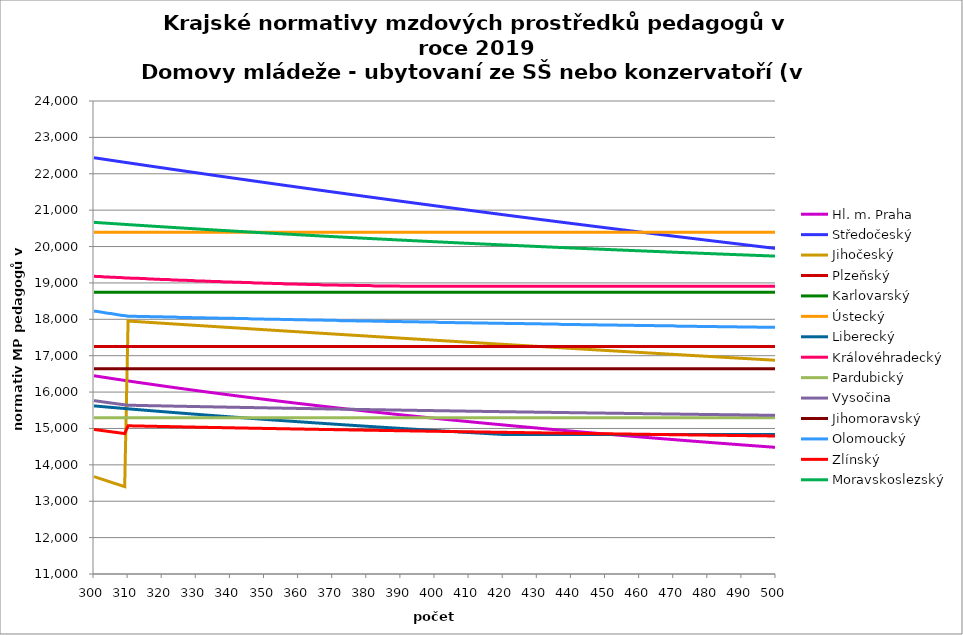
| Category | Hl. m. Praha | Středočeský | Jihočeský | Plzeňský | Karlovarský  | Ústecký   | Liberecký | Královéhradecký | Pardubický | Vysočina | Jihomoravský | Olomoucký | Zlínský | Moravskoslezský |
|---|---|---|---|---|---|---|---|---|---|---|---|---|---|---|
| 300.0 | 16448.592 | 22440.625 | 13677.41 | 17250 | 18742.857 | 20395.281 | 15620.336 | 19183.721 | 15293.222 | 15765.083 | 16640.392 | 18224.319 | 14973.191 | 20665.222 |
| 301.0 | 16434.039 | 22426.608 | 13646.147 | 17250 | 18742.857 | 20395.281 | 15612.162 | 19174.431 | 15293.222 | 15751.859 | 16640.392 | 18216.054 | 14960.34 | 20658.89 |
| 302.0 | 16419.559 | 22412.609 | 13615.027 | 17250 | 18742.857 | 20395.281 | 15604.023 | 19174.431 | 15293.222 | 15738.657 | 16640.392 | 18199.547 | 14947.554 | 20652.582 |
| 303.0 | 16405.153 | 22398.628 | 13584.048 | 17250 | 18742.857 | 20395.281 | 15595.92 | 19165.15 | 15293.222 | 15725.477 | 16640.392 | 18183.069 | 14934.831 | 20646.299 |
| 304.0 | 16390.819 | 22384.663 | 13553.21 | 17250 | 18742.857 | 20395.281 | 15587.852 | 19165.15 | 15293.222 | 15712.916 | 16640.392 | 18166.621 | 14922.172 | 20640.041 |
| 305.0 | 16376.558 | 22370.717 | 13522.511 | 17250 | 18742.857 | 20395.281 | 15579.819 | 19155.878 | 15293.222 | 15699.78 | 16640.392 | 18158.409 | 14909.576 | 20633.807 |
| 306.0 | 16362.367 | 22356.787 | 13491.951 | 17250 | 18742.857 | 20395.281 | 15571.82 | 19155.878 | 15293.222 | 15687.26 | 16640.392 | 18142.005 | 14897.042 | 20627.597 |
| 307.0 | 16348.248 | 22342.875 | 13461.53 | 17250 | 18742.857 | 20395.281 | 15563.856 | 19146.615 | 15293.222 | 15674.166 | 16640.392 | 18125.632 | 14884.57 | 20621.411 |
| 308.0 | 16334.198 | 22328.98 | 13431.245 | 17250 | 18742.857 | 20395.281 | 15555.925 | 19146.615 | 15293.222 | 15661.688 | 16640.392 | 18109.288 | 14872.159 | 20615.248 |
| 309.0 | 16320.218 | 22315.103 | 13401.096 | 17250 | 18742.857 | 20395.281 | 15548.029 | 19137.361 | 15293.222 | 15649.229 | 16640.392 | 18101.127 | 14859.809 | 20609.11 |
| 310.0 | 16306.307 | 22301.242 | 17952.762 | 17250 | 18742.857 | 20395.281 | 15540.165 | 19137.361 | 15293.222 | 15638.566 | 16640.392 | 18084.827 | 15073.362 | 20602.995 |
| 311.0 | 16292.465 | 22287.399 | 17946.723 | 17250 | 18742.857 | 20395.281 | 15532.335 | 19128.116 | 15293.222 | 15636.79 | 16640.392 | 18084.827 | 15071.439 | 20596.903 |
| 312.0 | 16278.69 | 22273.573 | 17940.688 | 17250 | 18742.857 | 20395.281 | 15524.539 | 19128.116 | 15293.222 | 15635.015 | 16640.392 | 18084.827 | 15069.522 | 20590.834 |
| 313.0 | 16264.983 | 22259.764 | 17934.657 | 17250 | 18742.857 | 20395.281 | 15516.774 | 19128.116 | 15293.222 | 15633.24 | 16640.392 | 18076.688 | 15067.612 | 20584.789 |
| 314.0 | 16251.342 | 22245.973 | 17928.63 | 17250 | 18742.857 | 20395.281 | 15509.043 | 19118.88 | 15293.222 | 15631.465 | 16640.392 | 18076.688 | 15065.709 | 20578.766 |
| 315.0 | 16237.767 | 22232.198 | 17922.607 | 17250 | 18742.857 | 20395.281 | 15501.343 | 19118.88 | 15293.222 | 15629.1 | 16640.392 | 18076.688 | 15063.812 | 20572.766 |
| 316.0 | 16224.258 | 22218.441 | 17916.589 | 17250 | 18742.857 | 20395.281 | 15493.676 | 19109.653 | 15293.222 | 15627.326 | 16640.392 | 18076.688 | 15061.921 | 20566.788 |
| 317.0 | 16210.814 | 22204.7 | 17910.574 | 17250 | 18742.857 | 20395.281 | 15486.04 | 19109.653 | 15293.222 | 15625.553 | 16640.392 | 18068.556 | 15060.037 | 20560.833 |
| 318.0 | 16197.434 | 22190.977 | 17904.563 | 17250 | 18742.857 | 20395.281 | 15478.436 | 19100.434 | 15293.222 | 15623.78 | 16640.392 | 18068.556 | 15058.16 | 20554.899 |
| 319.0 | 16184.119 | 22177.27 | 17898.557 | 17250 | 18742.857 | 20395.281 | 15470.863 | 19100.434 | 15293.222 | 15622.008 | 16640.392 | 18068.556 | 15056.288 | 20548.988 |
| 320.0 | 16170.866 | 22163.58 | 17892.554 | 17250 | 18742.857 | 20395.281 | 15463.321 | 19091.225 | 15293.222 | 15620.236 | 16640.392 | 18068.556 | 15054.423 | 20543.099 |
| 321.0 | 16157.677 | 22149.907 | 17886.555 | 17250 | 18742.857 | 20395.281 | 15455.81 | 19091.225 | 15293.222 | 15618.464 | 16640.392 | 18060.432 | 15052.565 | 20537.232 |
| 322.0 | 16144.55 | 22136.252 | 17880.561 | 17250 | 18742.857 | 20395.281 | 15448.33 | 19091.225 | 15293.222 | 15616.103 | 16640.392 | 18060.432 | 15050.712 | 20531.386 |
| 323.0 | 16131.485 | 22122.612 | 17874.57 | 17250 | 18742.857 | 20395.281 | 15440.88 | 19082.024 | 15293.222 | 15614.332 | 16640.392 | 18060.432 | 15048.866 | 20525.561 |
| 324.0 | 16118.482 | 22108.99 | 17868.584 | 17250 | 18742.857 | 20395.281 | 15433.46 | 19082.024 | 15293.222 | 15612.562 | 16640.392 | 18060.432 | 15047.026 | 20519.758 |
| 325.0 | 16105.539 | 22095.385 | 17862.601 | 17250 | 18742.857 | 20395.281 | 15426.07 | 19072.832 | 15293.222 | 15610.792 | 16640.392 | 18052.315 | 15045.192 | 20513.976 |
| 326.0 | 16092.657 | 22081.796 | 17856.623 | 17250 | 18742.857 | 20395.281 | 15418.71 | 19072.832 | 15293.222 | 15609.023 | 16640.392 | 18052.315 | 15043.364 | 20508.215 |
| 327.0 | 16079.835 | 22068.224 | 17850.648 | 17250 | 18742.857 | 20395.281 | 15411.38 | 19072.832 | 15293.222 | 15607.253 | 16640.392 | 18052.315 | 15041.542 | 20502.475 |
| 328.0 | 16067.072 | 22054.668 | 17844.678 | 17250 | 18742.857 | 20395.281 | 15404.078 | 19063.649 | 15293.222 | 15605.485 | 16640.392 | 18052.315 | 15039.726 | 20496.755 |
| 329.0 | 16054.369 | 22041.13 | 17838.711 | 17250 | 18742.857 | 20395.281 | 15396.806 | 19063.649 | 15293.222 | 15603.717 | 16640.392 | 18044.205 | 15037.916 | 20491.056 |
| 330.0 | 16041.724 | 22027.607 | 17832.748 | 17250 | 18742.857 | 20395.281 | 15389.563 | 19054.475 | 15293.222 | 15601.949 | 16640.392 | 18044.205 | 15036.112 | 20485.378 |
| 331.0 | 16029.137 | 22014.102 | 17826.79 | 17250 | 18742.857 | 20395.281 | 15382.349 | 19054.475 | 15293.222 | 15600.181 | 16640.392 | 18044.205 | 15034.314 | 20479.72 |
| 332.0 | 16016.607 | 22000.613 | 17820.835 | 17250 | 18742.857 | 20395.281 | 15375.163 | 19054.475 | 15293.222 | 15598.414 | 16640.392 | 18044.205 | 15032.522 | 20474.082 |
| 333.0 | 16004.135 | 21987.14 | 17814.885 | 17250 | 18742.857 | 20395.281 | 15368.005 | 19045.31 | 15293.222 | 15596.648 | 16640.392 | 18036.102 | 15030.736 | 20468.464 |
| 334.0 | 15991.719 | 21973.684 | 17808.938 | 17250 | 18742.857 | 20395.281 | 15360.875 | 19045.31 | 15293.222 | 15594.881 | 16640.392 | 18036.102 | 15028.955 | 20462.866 |
| 335.0 | 15979.36 | 21960.245 | 17802.995 | 17250 | 18742.857 | 20395.281 | 15353.774 | 19036.154 | 15293.222 | 15593.115 | 16640.392 | 18036.102 | 15027.18 | 20457.288 |
| 336.0 | 15967.056 | 21946.822 | 17797.057 | 17250 | 18742.857 | 20395.281 | 15346.7 | 19036.154 | 15293.222 | 15591.35 | 16640.392 | 18036.102 | 15025.411 | 20451.729 |
| 337.0 | 15954.808 | 21933.415 | 17791.122 | 17250 | 18742.857 | 20395.281 | 15339.653 | 19036.154 | 15293.222 | 15589.585 | 16640.392 | 18028.007 | 15023.647 | 20446.19 |
| 338.0 | 15942.615 | 21920.024 | 17785.191 | 17250 | 18742.857 | 20395.281 | 15332.634 | 19027.006 | 15293.222 | 15587.82 | 16640.392 | 18028.007 | 15021.89 | 20440.671 |
| 339.0 | 15930.477 | 21906.65 | 17779.264 | 17250 | 18742.857 | 20395.281 | 15325.642 | 19027.006 | 15293.222 | 15586.056 | 16640.392 | 18028.007 | 15020.137 | 20435.17 |
| 340.0 | 15918.392 | 21893.293 | 17773.341 | 17250 | 18742.857 | 20395.281 | 15318.677 | 19027.006 | 15293.222 | 15584.292 | 16640.392 | 18028.007 | 15018.391 | 20429.689 |
| 341.0 | 15906.362 | 21879.951 | 17767.422 | 17250 | 18742.857 | 20395.281 | 15311.738 | 19017.867 | 15293.222 | 15582.529 | 16640.392 | 18028.007 | 15016.649 | 20424.227 |
| 342.0 | 15894.384 | 21866.626 | 17761.507 | 17250 | 18742.857 | 20395.281 | 15304.827 | 19017.867 | 15293.222 | 15580.766 | 16640.392 | 18019.919 | 15014.914 | 20418.784 |
| 343.0 | 15882.46 | 21853.317 | 17755.596 | 17250 | 18742.857 | 20395.281 | 15297.941 | 19017.867 | 15293.222 | 15579.003 | 16640.392 | 18019.919 | 15013.184 | 20413.359 |
| 344.0 | 15870.588 | 21840.024 | 17749.689 | 17250 | 18742.857 | 20395.281 | 15291.082 | 19008.737 | 15293.222 | 15577.241 | 16640.392 | 18019.919 | 15011.459 | 20407.954 |
| 345.0 | 15858.768 | 21826.748 | 17743.786 | 17250 | 18742.857 | 20395.281 | 15284.249 | 19008.737 | 15293.222 | 15575.479 | 16640.392 | 18019.919 | 15009.74 | 20402.566 |
| 346.0 | 15847 | 21813.487 | 17737.887 | 17250 | 18742.857 | 20395.281 | 15277.442 | 19008.737 | 15293.222 | 15574.304 | 16640.392 | 18011.839 | 15008.026 | 20397.197 |
| 347.0 | 15835.284 | 21800.243 | 17731.991 | 17250 | 18742.857 | 20395.281 | 15270.66 | 18999.616 | 15293.222 | 15572.543 | 16640.392 | 18011.839 | 15006.317 | 20391.847 |
| 348.0 | 15823.618 | 21787.015 | 17726.1 | 17250 | 18742.857 | 20395.281 | 15263.904 | 18999.616 | 15293.222 | 15570.782 | 16640.392 | 18011.839 | 15004.614 | 20386.515 |
| 349.0 | 15812.003 | 21773.802 | 17720.212 | 17250 | 18742.857 | 20395.281 | 15257.173 | 18999.616 | 15293.222 | 15569.022 | 16640.392 | 18011.839 | 15002.915 | 20381.2 |
| 350.0 | 15800.438 | 21760.606 | 17714.329 | 17250 | 18742.857 | 20395.281 | 15250.467 | 18990.504 | 15293.222 | 15567.262 | 16640.392 | 18003.765 | 15001.223 | 20375.904 |
| 351.0 | 15788.923 | 21747.426 | 17708.449 | 17250 | 18742.857 | 20395.281 | 15243.787 | 18990.504 | 15293.222 | 15565.502 | 16640.392 | 18003.765 | 14999.535 | 20370.625 |
| 352.0 | 15777.457 | 21734.262 | 17702.573 | 17250 | 18742.857 | 20395.281 | 15237.131 | 18990.504 | 15293.222 | 15563.743 | 16640.392 | 18003.765 | 14997.853 | 20365.365 |
| 353.0 | 15766.04 | 21721.113 | 17696.701 | 17250 | 18742.857 | 20395.281 | 15230.5 | 18981.4 | 15293.222 | 15562.571 | 16640.392 | 18003.765 | 14996.175 | 20360.122 |
| 354.0 | 15754.673 | 21707.981 | 17690.833 | 17250 | 18742.857 | 20395.281 | 15223.893 | 18981.4 | 15293.222 | 15560.812 | 16640.392 | 18003.765 | 14994.503 | 20354.896 |
| 355.0 | 15743.353 | 21694.864 | 17684.969 | 17250 | 18742.857 | 20395.281 | 15217.311 | 18981.4 | 15293.222 | 15559.054 | 16640.392 | 17995.699 | 14992.836 | 20349.688 |
| 356.0 | 15732.082 | 21681.763 | 17679.109 | 17250 | 18742.857 | 20395.281 | 15210.753 | 18972.305 | 15293.222 | 15557.296 | 16640.392 | 17995.699 | 14991.174 | 20344.497 |
| 357.0 | 15720.858 | 21668.678 | 17673.253 | 17250 | 18742.857 | 20395.281 | 15204.219 | 18972.305 | 15293.222 | 15555.539 | 16640.392 | 17995.699 | 14989.517 | 20339.323 |
| 358.0 | 15709.682 | 21655.609 | 17667.4 | 17250 | 18742.857 | 20395.281 | 15197.709 | 18972.305 | 15293.222 | 15553.782 | 16640.392 | 17995.699 | 14987.865 | 20334.167 |
| 359.0 | 15698.552 | 21642.556 | 17661.552 | 17250 | 18742.857 | 20395.281 | 15191.222 | 18972.305 | 15293.222 | 15552.611 | 16640.392 | 17987.64 | 14986.218 | 20329.027 |
| 360.0 | 15687.469 | 21629.518 | 17655.707 | 17250 | 18742.857 | 20395.281 | 15184.759 | 18963.218 | 15293.222 | 15550.854 | 16640.392 | 17987.64 | 14984.576 | 20323.905 |
| 361.0 | 15676.433 | 21616.496 | 17649.866 | 17250 | 18742.857 | 20395.281 | 15178.32 | 18963.218 | 15293.222 | 15549.099 | 16640.392 | 17987.64 | 14982.939 | 20318.799 |
| 362.0 | 15665.442 | 21603.49 | 17644.029 | 17250 | 18742.857 | 20395.281 | 15171.903 | 18963.218 | 15293.222 | 15547.343 | 16640.392 | 17987.64 | 14981.306 | 20313.709 |
| 363.0 | 15654.497 | 21590.499 | 17638.196 | 17250 | 18742.857 | 20395.281 | 15165.51 | 18954.141 | 15293.222 | 15546.173 | 16640.392 | 17979.588 | 14979.679 | 20308.637 |
| 364.0 | 15643.598 | 21577.524 | 17632.367 | 17250 | 18742.857 | 20395.281 | 15159.14 | 18954.141 | 15293.222 | 15544.418 | 16640.392 | 17979.588 | 14978.056 | 20303.581 |
| 365.0 | 15632.743 | 21564.565 | 17626.541 | 17250 | 18742.857 | 20395.281 | 15152.792 | 18954.141 | 15293.222 | 15542.664 | 16640.392 | 17979.588 | 14976.438 | 20298.541 |
| 366.0 | 15621.934 | 21551.621 | 17620.72 | 17250 | 18742.857 | 20395.281 | 15146.468 | 18954.141 | 15293.222 | 15540.91 | 16640.392 | 17979.588 | 14974.825 | 20293.517 |
| 367.0 | 15611.168 | 21538.692 | 17614.902 | 17250 | 18742.857 | 20395.281 | 15140.165 | 18945.072 | 15293.222 | 15539.74 | 16640.392 | 17979.588 | 14973.217 | 20288.51 |
| 368.0 | 15600.447 | 21525.779 | 17609.088 | 17250 | 18742.857 | 20395.281 | 15133.886 | 18945.072 | 15293.222 | 15537.987 | 16640.392 | 17971.544 | 14971.614 | 20283.519 |
| 369.0 | 15589.769 | 21512.882 | 17603.278 | 17250 | 18742.857 | 20395.281 | 15127.628 | 18945.072 | 15293.222 | 15536.234 | 16640.392 | 17971.544 | 14970.015 | 20278.543 |
| 370.0 | 15579.135 | 21500 | 17597.472 | 17250 | 18742.857 | 20395.281 | 15121.392 | 18945.072 | 15293.222 | 15534.481 | 16640.392 | 17971.544 | 14968.421 | 20273.584 |
| 371.0 | 15568.544 | 21487.133 | 17591.669 | 17250 | 18742.857 | 20395.281 | 15115.179 | 18945.072 | 15293.222 | 15533.313 | 16640.392 | 17971.544 | 14966.831 | 20268.64 |
| 372.0 | 15557.996 | 21474.282 | 17585.871 | 17250 | 18742.857 | 20395.281 | 15108.987 | 18936.011 | 15293.222 | 15531.561 | 16640.392 | 17963.506 | 14965.246 | 20263.713 |
| 373.0 | 15547.49 | 21461.447 | 17580.076 | 17250 | 18742.857 | 20395.281 | 15102.817 | 18936.011 | 15293.222 | 15529.81 | 16640.392 | 17963.506 | 14963.666 | 20258.8 |
| 374.0 | 15537.027 | 21448.626 | 17574.285 | 17250 | 18742.857 | 20395.281 | 15096.668 | 18936.011 | 15293.222 | 15528.642 | 16640.392 | 17963.506 | 14962.09 | 20253.904 |
| 375.0 | 15526.605 | 21435.821 | 17568.498 | 17250 | 18742.857 | 20395.281 | 15090.541 | 18936.011 | 15293.222 | 15526.891 | 16640.392 | 17963.506 | 14960.519 | 20249.022 |
| 376.0 | 15516.226 | 21423.031 | 17562.714 | 17250 | 18742.857 | 20395.281 | 15084.435 | 18936.011 | 15293.222 | 15525.141 | 16640.392 | 17963.506 | 14958.952 | 20244.156 |
| 377.0 | 15505.887 | 21410.256 | 17556.935 | 17250 | 18742.857 | 20395.281 | 15078.35 | 18926.96 | 15293.222 | 15523.974 | 16640.392 | 17955.476 | 14957.39 | 20239.306 |
| 378.0 | 15495.59 | 21397.497 | 17551.159 | 17250 | 18742.857 | 20395.281 | 15072.286 | 18926.96 | 15293.222 | 15522.224 | 16640.392 | 17955.476 | 14955.832 | 20234.47 |
| 379.0 | 15485.333 | 21384.753 | 17545.387 | 17250 | 18742.857 | 20395.281 | 15066.243 | 18926.96 | 15293.222 | 15520.475 | 16640.392 | 17955.476 | 14954.278 | 20229.65 |
| 380.0 | 15475.117 | 21372.024 | 17539.619 | 17250 | 18742.857 | 20395.281 | 15060.221 | 18926.96 | 15293.222 | 15519.309 | 16640.392 | 17955.476 | 14952.73 | 20224.844 |
| 381.0 | 15464.942 | 21359.31 | 17533.855 | 17250 | 18742.857 | 20395.281 | 15054.22 | 18926.96 | 15293.222 | 15517.56 | 16640.392 | 17955.476 | 14951.185 | 20220.054 |
| 382.0 | 15454.806 | 21346.611 | 17528.094 | 17250 | 18742.857 | 20395.281 | 15048.239 | 18917.917 | 15293.222 | 15516.394 | 16640.392 | 17947.453 | 14949.645 | 20215.278 |
| 383.0 | 15444.71 | 21333.928 | 17522.338 | 17250 | 18742.857 | 20395.281 | 15042.278 | 18917.917 | 15293.222 | 15514.646 | 16640.392 | 17947.453 | 14948.109 | 20210.517 |
| 384.0 | 15434.654 | 21321.259 | 17516.585 | 17250 | 18742.857 | 20395.281 | 15036.338 | 18917.917 | 15293.222 | 15512.899 | 16640.392 | 17947.453 | 14946.577 | 20205.77 |
| 385.0 | 15424.636 | 21308.605 | 17510.835 | 17250 | 18742.857 | 20395.281 | 15030.417 | 18917.917 | 15293.222 | 15511.734 | 16640.392 | 17947.453 | 14945.05 | 20201.039 |
| 386.0 | 15414.658 | 21295.967 | 17505.09 | 17250 | 18742.857 | 20395.281 | 15024.517 | 18917.917 | 15293.222 | 15509.986 | 16640.392 | 17939.437 | 14943.527 | 20196.321 |
| 387.0 | 15404.718 | 21283.343 | 17499.348 | 17250 | 18742.857 | 20395.281 | 15018.636 | 18917.917 | 15293.222 | 15508.822 | 16640.392 | 17939.437 | 14942.009 | 20191.618 |
| 388.0 | 15394.817 | 21270.735 | 17493.61 | 17250 | 18742.857 | 20395.281 | 15012.776 | 18917.917 | 15293.222 | 15507.076 | 16640.392 | 17939.437 | 14940.494 | 20186.93 |
| 389.0 | 15384.954 | 21258.141 | 17487.876 | 17250 | 18742.857 | 20395.281 | 15006.935 | 18917.917 | 15293.222 | 15505.33 | 16640.392 | 17939.437 | 14938.984 | 20182.255 |
| 390.0 | 15375.129 | 21245.562 | 17482.146 | 17250 | 18742.857 | 20395.281 | 15001.113 | 18908.883 | 15293.222 | 15504.166 | 16640.392 | 17939.437 | 14937.478 | 20177.595 |
| 391.0 | 15365.341 | 21232.998 | 17476.419 | 17250 | 18742.857 | 20395.281 | 14995.311 | 18908.883 | 15293.222 | 15502.42 | 16640.392 | 17931.429 | 14935.976 | 20172.949 |
| 392.0 | 15355.591 | 21220.449 | 17470.696 | 17250 | 18742.857 | 20395.281 | 14989.528 | 18908.883 | 15293.222 | 15501.257 | 16640.392 | 17931.429 | 14934.478 | 20168.317 |
| 393.0 | 15345.878 | 21207.915 | 17464.977 | 17250 | 18742.857 | 20395.281 | 14983.765 | 18908.883 | 15293.222 | 15499.512 | 16640.392 | 17931.429 | 14932.984 | 20163.699 |
| 394.0 | 15336.202 | 21195.396 | 17459.262 | 17250 | 18742.857 | 20395.281 | 14978.02 | 18908.883 | 15293.222 | 15498.349 | 16640.392 | 17931.429 | 14931.495 | 20159.094 |
| 395.0 | 15326.562 | 21182.891 | 17453.55 | 17250 | 18742.857 | 20395.281 | 14972.294 | 18908.883 | 15293.222 | 15496.605 | 16640.392 | 17931.429 | 14930.009 | 20154.504 |
| 396.0 | 15316.959 | 21170.401 | 17447.842 | 17250 | 18742.857 | 20395.281 | 14966.588 | 18908.883 | 15293.222 | 15495.443 | 16640.392 | 17923.427 | 14928.528 | 20149.927 |
| 397.0 | 15307.393 | 21157.926 | 17442.138 | 17250 | 18742.857 | 20395.281 | 14960.899 | 18908.883 | 15293.222 | 15493.699 | 16640.392 | 17923.427 | 14927.05 | 20145.364 |
| 398.0 | 15297.862 | 21145.465 | 17436.438 | 17250 | 18742.857 | 20395.281 | 14955.23 | 18908.883 | 15293.222 | 15492.537 | 16640.392 | 17923.427 | 14925.577 | 20140.814 |
| 399.0 | 15288.367 | 21133.019 | 17430.741 | 17250 | 18742.857 | 20395.281 | 14949.579 | 18908.883 | 15293.222 | 15490.795 | 16640.392 | 17923.427 | 14924.107 | 20136.277 |
| 400.0 | 15278.907 | 21120.588 | 17425.048 | 17250 | 18742.857 | 20395.281 | 14943.947 | 18908.883 | 15293.222 | 15489.633 | 16640.392 | 17923.427 | 14922.642 | 20131.755 |
| 401.0 | 15269.483 | 21108.172 | 17419.359 | 17250 | 18742.857 | 20395.281 | 14938.332 | 18908.883 | 15293.222 | 15487.891 | 16640.392 | 17915.433 | 14921.18 | 20127.245 |
| 402.0 | 15260.093 | 21095.77 | 17413.673 | 17250 | 18742.857 | 20395.281 | 14932.736 | 18908.883 | 15293.222 | 15486.73 | 16640.392 | 17915.433 | 14919.723 | 20122.749 |
| 403.0 | 15250.739 | 21083.382 | 17407.991 | 17250 | 18742.857 | 20395.281 | 14927.158 | 18908.883 | 15293.222 | 15484.988 | 16640.392 | 17915.433 | 14918.269 | 20118.265 |
| 404.0 | 15241.419 | 21071.009 | 17402.313 | 17250 | 18742.857 | 20395.281 | 14921.598 | 18908.883 | 15293.222 | 15483.827 | 16640.392 | 17915.433 | 14916.819 | 20113.795 |
| 405.0 | 15232.134 | 21058.651 | 17396.639 | 17250 | 18742.857 | 20395.281 | 14916.056 | 18908.883 | 15293.222 | 15482.087 | 16640.392 | 17915.433 | 14915.373 | 20109.338 |
| 406.0 | 15222.882 | 21046.307 | 17390.968 | 17250 | 18742.857 | 20395.281 | 14910.532 | 18908.883 | 15293.222 | 15480.926 | 16640.392 | 17907.445 | 14913.931 | 20104.894 |
| 407.0 | 15213.665 | 21033.978 | 17385.301 | 17250 | 18742.857 | 20395.281 | 14905.025 | 18908.883 | 15293.222 | 15479.186 | 16640.392 | 17907.445 | 14912.493 | 20100.463 |
| 408.0 | 15204.482 | 21021.663 | 17379.638 | 17250 | 18742.857 | 20395.281 | 14899.536 | 18908.883 | 15293.222 | 15478.026 | 16640.392 | 17907.445 | 14911.059 | 20096.045 |
| 409.0 | 15195.331 | 21009.362 | 17373.978 | 17250 | 18742.857 | 20395.281 | 14894.064 | 18908.883 | 15293.222 | 15476.287 | 16640.392 | 17907.445 | 14909.628 | 20091.639 |
| 410.0 | 15186.215 | 20997.076 | 17368.322 | 17250 | 18742.857 | 20395.281 | 14888.61 | 18908.883 | 15293.222 | 15475.127 | 16640.392 | 17907.445 | 14908.201 | 20087.246 |
| 411.0 | 15177.131 | 20984.804 | 17362.67 | 17250 | 18742.857 | 20395.281 | 14883.173 | 18908.883 | 15293.222 | 15473.389 | 16640.392 | 17899.465 | 14906.778 | 20082.866 |
| 412.0 | 15168.08 | 20972.547 | 17357.021 | 17250 | 18742.857 | 20395.281 | 14877.753 | 18908.883 | 15293.222 | 15472.23 | 16640.392 | 17899.465 | 14905.358 | 20078.498 |
| 413.0 | 15159.062 | 20960.304 | 17351.376 | 17250 | 18742.857 | 20395.281 | 14872.35 | 18908.883 | 15293.222 | 15471.071 | 16640.392 | 17899.465 | 14903.943 | 20074.143 |
| 414.0 | 15150.077 | 20948.075 | 17345.735 | 17250 | 18742.857 | 20395.281 | 14866.964 | 18908.883 | 15293.222 | 15469.333 | 16640.392 | 17899.465 | 14902.531 | 20069.8 |
| 415.0 | 15141.123 | 20935.86 | 17340.097 | 17250 | 18742.857 | 20395.281 | 14861.595 | 18908.883 | 15293.222 | 15468.174 | 16640.392 | 17899.465 | 14901.122 | 20065.469 |
| 416.0 | 15132.202 | 20923.66 | 17334.463 | 17250 | 18742.857 | 20395.281 | 14856.243 | 18908.883 | 15293.222 | 15466.437 | 16640.392 | 17891.492 | 14899.718 | 20061.151 |
| 417.0 | 15123.313 | 20911.474 | 17328.833 | 17250 | 18742.857 | 20395.281 | 14850.907 | 18908.883 | 15293.222 | 15465.279 | 16640.392 | 17891.492 | 14898.317 | 20056.845 |
| 418.0 | 15114.455 | 20899.302 | 17323.206 | 17250 | 18742.857 | 20395.281 | 14845.588 | 18908.883 | 15293.222 | 15464.121 | 16640.392 | 17891.492 | 14896.919 | 20052.551 |
| 419.0 | 15105.629 | 20887.144 | 17317.583 | 17250 | 18742.857 | 20395.281 | 14840.286 | 18908.883 | 15293.222 | 15462.385 | 16640.392 | 17891.492 | 14895.525 | 20048.269 |
| 420.0 | 15096.834 | 20875 | 17311.964 | 17250 | 18742.857 | 20395.281 | 14835 | 18908.883 | 15293.222 | 15461.228 | 16640.392 | 17891.492 | 14894.135 | 20044 |
| 421.0 | 15088.07 | 20862.87 | 17306.348 | 17250 | 18742.857 | 20395.281 | 14835 | 18908.883 | 15293.222 | 15459.492 | 16640.392 | 17883.526 | 14892.748 | 20039.742 |
| 422.0 | 15079.337 | 20850.755 | 17300.736 | 17250 | 18742.857 | 20395.281 | 14835 | 18908.883 | 15293.222 | 15458.335 | 16640.392 | 17883.526 | 14891.365 | 20035.496 |
| 423.0 | 15070.635 | 20838.654 | 17295.128 | 17250 | 18742.857 | 20395.281 | 14835 | 18908.883 | 15293.222 | 15457.178 | 16640.392 | 17883.526 | 14889.985 | 20031.262 |
| 424.0 | 15061.964 | 20826.566 | 17289.523 | 17250 | 18742.857 | 20395.281 | 14835 | 18908.883 | 15293.222 | 15455.443 | 16640.392 | 17883.526 | 14888.609 | 20027.04 |
| 425.0 | 15053.323 | 20814.493 | 17283.922 | 17250 | 18742.857 | 20395.281 | 14835 | 18908.883 | 15293.222 | 15454.287 | 16640.392 | 17883.526 | 14887.237 | 20022.829 |
| 426.0 | 15044.712 | 20802.433 | 17278.325 | 17250 | 18742.857 | 20395.281 | 14835 | 18908.883 | 15293.222 | 15453.131 | 16640.392 | 17883.526 | 14885.868 | 20018.63 |
| 427.0 | 15036.131 | 20790.388 | 17272.731 | 17250 | 18742.857 | 20395.281 | 14835 | 18908.883 | 15293.222 | 15451.397 | 16640.392 | 17875.567 | 14884.502 | 20014.443 |
| 428.0 | 15027.58 | 20778.356 | 17267.14 | 17250 | 18742.857 | 20395.281 | 14835 | 18908.883 | 15293.222 | 15450.241 | 16640.392 | 17875.567 | 14883.14 | 20010.267 |
| 429.0 | 15019.058 | 20766.339 | 17261.554 | 17250 | 18742.857 | 20395.281 | 14835 | 18908.883 | 15293.222 | 15449.086 | 16640.392 | 17875.567 | 14881.781 | 20006.103 |
| 430.0 | 15010.566 | 20754.335 | 17255.971 | 17250 | 18742.857 | 20395.281 | 14835 | 18908.883 | 15293.222 | 15447.353 | 16640.392 | 17875.567 | 14880.425 | 20001.95 |
| 431.0 | 15002.103 | 20742.345 | 17250.391 | 17250 | 18742.857 | 20395.281 | 14835 | 18908.883 | 15293.222 | 15446.198 | 16640.392 | 17875.567 | 14879.073 | 19997.809 |
| 432.0 | 14993.67 | 20730.37 | 17244.816 | 17250 | 18742.857 | 20395.281 | 14835 | 18908.883 | 15293.222 | 15445.043 | 16640.392 | 17867.616 | 14877.725 | 19993.678 |
| 433.0 | 14985.265 | 20718.407 | 17239.243 | 17250 | 18742.857 | 20395.281 | 14835 | 18908.883 | 15293.222 | 15443.311 | 16640.392 | 17867.616 | 14876.38 | 19989.559 |
| 434.0 | 14976.889 | 20706.459 | 17233.675 | 17250 | 18742.857 | 20395.281 | 14835 | 18908.883 | 15293.222 | 15442.156 | 16640.392 | 17867.616 | 14875.038 | 19985.452 |
| 435.0 | 14968.542 | 20694.524 | 17228.11 | 17250 | 18742.857 | 20395.281 | 14835 | 18908.883 | 15293.222 | 15441.002 | 16640.392 | 17867.616 | 14873.699 | 19981.355 |
| 436.0 | 14960.223 | 20682.604 | 17222.548 | 17250 | 18742.857 | 20395.281 | 14835 | 18908.883 | 15293.222 | 15439.27 | 16640.392 | 17867.616 | 14872.364 | 19977.27 |
| 437.0 | 14951.932 | 20670.697 | 17216.99 | 17250 | 18742.857 | 20395.281 | 14835 | 18908.883 | 15293.222 | 15438.117 | 16640.392 | 17859.671 | 14871.032 | 19973.195 |
| 438.0 | 14943.67 | 20658.803 | 17211.436 | 17250 | 18742.857 | 20395.281 | 14835 | 18908.883 | 15293.222 | 15436.963 | 16640.392 | 17859.671 | 14869.703 | 19969.132 |
| 439.0 | 14935.435 | 20646.924 | 17205.886 | 17250 | 18742.857 | 20395.281 | 14835 | 18908.883 | 15293.222 | 15435.809 | 16640.392 | 17859.671 | 14868.378 | 19965.079 |
| 440.0 | 14927.228 | 20635.057 | 17200.339 | 17250 | 18742.857 | 20395.281 | 14835 | 18908.883 | 15293.222 | 15434.079 | 16640.392 | 17859.671 | 14867.056 | 19961.037 |
| 441.0 | 14919.049 | 20623.205 | 17194.795 | 17250 | 18742.857 | 20395.281 | 14835 | 18908.883 | 15293.222 | 15432.926 | 16640.392 | 17859.671 | 14865.737 | 19957.006 |
| 442.0 | 14910.898 | 20611.366 | 17189.255 | 17250 | 18742.857 | 20395.281 | 14835 | 18908.883 | 15293.222 | 15431.773 | 16640.392 | 17859.671 | 14864.421 | 19952.986 |
| 443.0 | 14902.773 | 20599.541 | 17183.719 | 17250 | 18742.857 | 20395.281 | 14835 | 18908.883 | 15293.222 | 15430.044 | 16640.392 | 17851.733 | 14863.108 | 19948.977 |
| 444.0 | 14894.676 | 20587.729 | 17178.186 | 17250 | 18742.857 | 20395.281 | 14835 | 18908.883 | 15293.222 | 15428.892 | 16640.392 | 17851.733 | 14861.799 | 19944.978 |
| 445.0 | 14886.605 | 20575.931 | 17172.657 | 17250 | 18742.857 | 20395.281 | 14835 | 18908.883 | 15293.222 | 15427.739 | 16640.392 | 17851.733 | 14860.493 | 19940.989 |
| 446.0 | 14878.562 | 20564.147 | 17167.131 | 17250 | 18742.857 | 20395.281 | 14835 | 18908.883 | 15293.222 | 15426.587 | 16640.392 | 17851.733 | 14859.19 | 19937.012 |
| 447.0 | 14870.545 | 20552.376 | 17161.609 | 17250 | 18742.857 | 20395.281 | 14835 | 18908.883 | 15293.222 | 15424.859 | 16640.392 | 17851.733 | 14857.89 | 19933.045 |
| 448.0 | 14862.555 | 20540.618 | 17156.09 | 17250 | 18742.857 | 20395.281 | 14835 | 18908.883 | 15293.222 | 15423.707 | 16640.392 | 17843.803 | 14856.593 | 19929.088 |
| 449.0 | 14854.591 | 20528.874 | 17150.575 | 17250 | 18742.857 | 20395.281 | 14835 | 18908.883 | 15293.222 | 15422.556 | 16640.392 | 17843.803 | 14855.3 | 19925.141 |
| 450.0 | 14846.653 | 20517.143 | 17145.064 | 17250 | 18742.857 | 20395.281 | 14835 | 18908.883 | 15293.222 | 15421.404 | 16640.392 | 17843.803 | 14854.009 | 19921.205 |
| 451.0 | 14838.742 | 20505.425 | 17139.556 | 17250 | 18742.857 | 20395.281 | 14835 | 18908.883 | 15293.222 | 15420.253 | 16640.392 | 17843.803 | 14852.722 | 19917.28 |
| 452.0 | 14830.856 | 20493.721 | 17134.051 | 17250 | 18742.857 | 20395.281 | 14835 | 18908.883 | 15293.222 | 15418.527 | 16640.392 | 17843.803 | 14851.437 | 19913.364 |
| 453.0 | 14822.996 | 20482.031 | 17128.551 | 17250 | 18742.857 | 20395.281 | 14835 | 18908.883 | 15293.222 | 15417.376 | 16640.392 | 17843.803 | 14850.156 | 19909.459 |
| 454.0 | 14815.162 | 20470.353 | 17123.053 | 17250 | 18742.857 | 20395.281 | 14835 | 18908.883 | 15293.222 | 15416.225 | 16640.392 | 17835.879 | 14848.878 | 19905.563 |
| 455.0 | 14807.353 | 20458.689 | 17117.559 | 17250 | 18742.857 | 20395.281 | 14835 | 18908.883 | 15293.222 | 15415.075 | 16640.392 | 17835.879 | 14847.603 | 19901.678 |
| 456.0 | 14799.569 | 20447.039 | 17112.069 | 17250 | 18742.857 | 20395.281 | 14835 | 18908.883 | 15293.222 | 15413.924 | 16640.392 | 17835.879 | 14846.331 | 19897.803 |
| 457.0 | 14791.811 | 20435.401 | 17106.582 | 17250 | 18742.857 | 20395.281 | 14835 | 18908.883 | 15293.222 | 15412.199 | 16640.392 | 17835.879 | 14845.061 | 19893.938 |
| 458.0 | 14784.078 | 20423.777 | 17101.099 | 17250 | 18742.857 | 20395.281 | 14835 | 18908.883 | 15293.222 | 15411.049 | 16640.392 | 17835.879 | 14843.795 | 19890.083 |
| 459.0 | 14776.37 | 20412.166 | 17095.619 | 17250 | 18742.857 | 20395.281 | 14835 | 18908.883 | 15293.222 | 15409.9 | 16640.392 | 17827.963 | 14842.532 | 19886.238 |
| 460.0 | 14768.686 | 20400.568 | 17090.143 | 17250 | 18742.857 | 20395.281 | 14835 | 18908.883 | 15293.222 | 15408.75 | 16640.392 | 17827.963 | 14841.272 | 19882.402 |
| 461.0 | 14761.027 | 20388.984 | 17084.67 | 17250 | 18742.857 | 20395.281 | 14835 | 18908.883 | 15293.222 | 15407.601 | 16640.392 | 17827.963 | 14840.015 | 19878.577 |
| 462.0 | 14753.393 | 20377.412 | 17079.201 | 17250 | 18742.857 | 20395.281 | 14835 | 18908.883 | 15293.222 | 15405.877 | 16640.392 | 17827.963 | 14838.76 | 19874.761 |
| 463.0 | 14745.783 | 20365.854 | 17073.735 | 17250 | 18742.857 | 20395.281 | 14835 | 18908.883 | 15293.222 | 15404.728 | 16640.392 | 17827.963 | 14837.509 | 19870.955 |
| 464.0 | 14738.197 | 20354.308 | 17068.273 | 17250 | 18742.857 | 20395.281 | 14835 | 18908.883 | 15293.222 | 15403.579 | 16640.392 | 17827.963 | 14836.26 | 19867.158 |
| 465.0 | 14730.636 | 20342.776 | 17062.815 | 17250 | 18742.857 | 20395.281 | 14835 | 18908.883 | 15293.222 | 15402.431 | 16640.392 | 17820.053 | 14835.015 | 19863.372 |
| 466.0 | 14723.098 | 20331.257 | 17057.359 | 17250 | 18742.857 | 20395.281 | 14835 | 18908.883 | 15293.222 | 15401.282 | 16640.392 | 17820.053 | 14833.772 | 19859.594 |
| 467.0 | 14715.584 | 20319.751 | 17051.908 | 17250 | 18742.857 | 20395.281 | 14835 | 18908.883 | 15293.222 | 15400.134 | 16640.392 | 17820.053 | 14832.532 | 19855.827 |
| 468.0 | 14708.094 | 20308.258 | 17046.459 | 17250 | 18742.857 | 20395.281 | 14835 | 18908.883 | 15293.222 | 15398.986 | 16640.392 | 17820.053 | 14831.295 | 19852.068 |
| 469.0 | 14700.627 | 20296.778 | 17041.015 | 17250 | 18742.857 | 20395.281 | 14835 | 18908.883 | 15293.222 | 15397.264 | 16640.392 | 17820.053 | 14830.061 | 19848.32 |
| 470.0 | 14693.184 | 20285.311 | 17035.573 | 17250 | 18742.857 | 20395.281 | 14835 | 18908.883 | 15293.222 | 15396.117 | 16640.392 | 17820.053 | 14828.83 | 19844.58 |
| 471.0 | 14685.765 | 20273.857 | 17030.135 | 17250 | 18742.857 | 20395.281 | 14835 | 18908.883 | 15293.222 | 15394.969 | 16640.392 | 17812.151 | 14827.601 | 19840.85 |
| 472.0 | 14678.368 | 20262.415 | 17024.701 | 17250 | 18742.857 | 20395.281 | 14835 | 18908.883 | 15293.222 | 15393.822 | 16640.392 | 17812.151 | 14826.375 | 19837.129 |
| 473.0 | 14670.995 | 20250.987 | 17019.27 | 17250 | 18742.857 | 20395.281 | 14835 | 18908.883 | 15293.222 | 15392.675 | 16640.392 | 17812.151 | 14825.152 | 19833.418 |
| 474.0 | 14663.644 | 20239.572 | 17013.843 | 17250 | 18742.857 | 20395.281 | 14835 | 18908.883 | 15293.222 | 15391.528 | 16640.392 | 17812.151 | 14823.932 | 19829.716 |
| 475.0 | 14656.317 | 20228.169 | 17008.419 | 17250 | 18742.857 | 20395.281 | 14835 | 18908.883 | 15293.222 | 15390.381 | 16640.392 | 17812.151 | 14822.715 | 19826.022 |
| 476.0 | 14649.012 | 20216.779 | 17002.998 | 17250 | 18742.857 | 20395.281 | 14835 | 18908.883 | 15293.222 | 15389.234 | 16640.392 | 17812.151 | 14821.5 | 19822.338 |
| 477.0 | 14641.729 | 20205.402 | 16997.581 | 17250 | 18742.857 | 20395.281 | 14835 | 18908.883 | 15293.222 | 15387.515 | 16640.392 | 17804.255 | 14820.289 | 19818.664 |
| 478.0 | 14634.469 | 20194.038 | 16992.168 | 17250 | 18742.857 | 20395.281 | 14835 | 18908.883 | 15293.222 | 15386.369 | 16640.392 | 17804.255 | 14819.079 | 19814.998 |
| 479.0 | 14627.232 | 20182.687 | 16986.757 | 17250 | 18742.857 | 20395.281 | 14835 | 18908.883 | 15293.222 | 15385.223 | 16640.392 | 17804.255 | 14817.873 | 19811.341 |
| 480.0 | 14620.016 | 20171.348 | 16981.351 | 17250 | 18742.857 | 20395.281 | 14835 | 18908.883 | 15293.222 | 15384.077 | 16640.392 | 17804.255 | 14816.669 | 19807.693 |
| 481.0 | 14612.823 | 20160.022 | 16975.947 | 17250 | 18742.857 | 20395.281 | 14835 | 18908.883 | 15293.222 | 15382.931 | 16640.392 | 17804.255 | 14815.468 | 19804.054 |
| 482.0 | 14605.652 | 20148.709 | 16970.548 | 17250 | 18742.857 | 20395.281 | 14835 | 18908.883 | 15293.222 | 15381.786 | 16640.392 | 17804.255 | 14814.27 | 19800.424 |
| 483.0 | 14598.503 | 20137.409 | 16965.151 | 17250 | 18742.857 | 20395.281 | 14835 | 18908.883 | 15293.222 | 15380.64 | 16640.392 | 17796.367 | 14813.075 | 19796.803 |
| 484.0 | 14591.375 | 20126.121 | 16959.758 | 17250 | 18742.857 | 20395.281 | 14835 | 18908.883 | 15293.222 | 15379.495 | 16640.392 | 17796.367 | 14811.882 | 19793.191 |
| 485.0 | 14584.269 | 20114.846 | 16954.369 | 17250 | 18742.857 | 20395.281 | 14835 | 18908.883 | 15293.222 | 15378.35 | 16640.392 | 17796.367 | 14810.691 | 19789.587 |
| 486.0 | 14577.185 | 20103.583 | 16948.983 | 17250 | 18742.857 | 20395.281 | 14835 | 18908.883 | 15293.222 | 15377.205 | 16640.392 | 17796.367 | 14809.504 | 19785.992 |
| 487.0 | 14570.122 | 20092.334 | 16943.6 | 17250 | 18742.857 | 20395.281 | 14835 | 18908.883 | 15293.222 | 15376.061 | 16640.392 | 17796.367 | 14808.319 | 19782.406 |
| 488.0 | 14563.08 | 20081.096 | 16938.221 | 17250 | 18742.857 | 20395.281 | 14835 | 18908.883 | 15293.222 | 15374.916 | 16640.392 | 17796.367 | 14807.136 | 19778.829 |
| 489.0 | 14556.059 | 20069.871 | 16932.845 | 17250 | 18742.857 | 20395.281 | 14835 | 18908.883 | 15293.222 | 15373.772 | 16640.392 | 17788.485 | 14805.956 | 19775.26 |
| 490.0 | 14549.06 | 20058.659 | 16927.472 | 17250 | 18742.857 | 20395.281 | 14835 | 18908.883 | 15293.222 | 15372.628 | 16640.392 | 17788.485 | 14804.779 | 19771.7 |
| 491.0 | 14542.082 | 20047.46 | 16922.103 | 17250 | 18742.857 | 20395.281 | 14835 | 18908.883 | 15293.222 | 15371.484 | 16640.392 | 17788.485 | 14803.605 | 19768.148 |
| 492.0 | 14535.124 | 20036.272 | 16916.738 | 17250 | 18742.857 | 20395.281 | 14835 | 18908.883 | 15293.222 | 15370.34 | 16640.392 | 17788.485 | 14802.433 | 19764.605 |
| 493.0 | 14528.187 | 20025.098 | 16911.375 | 17250 | 18742.857 | 20395.281 | 14835 | 18908.883 | 15293.222 | 15368.625 | 16640.392 | 17788.485 | 14801.263 | 19761.07 |
| 494.0 | 14521.271 | 20013.935 | 16906.016 | 17250 | 18742.857 | 20395.281 | 14835 | 18908.883 | 15293.222 | 15367.481 | 16640.392 | 17788.485 | 14800.096 | 19757.543 |
| 495.0 | 14514.375 | 20002.786 | 16900.661 | 17250 | 18742.857 | 20395.281 | 14835 | 18908.883 | 15293.222 | 15366.338 | 16640.392 | 17780.611 | 14798.932 | 19754.025 |
| 496.0 | 14507.5 | 19991.648 | 16895.309 | 17250 | 18742.857 | 20395.281 | 14835 | 18908.883 | 15293.222 | 15365.195 | 16640.392 | 17780.611 | 14797.77 | 19750.516 |
| 497.0 | 14500.645 | 19980.523 | 16889.96 | 17250 | 18742.857 | 20395.281 | 14835 | 18908.883 | 15293.222 | 15364.052 | 16640.392 | 17780.611 | 14796.611 | 19747.014 |
| 498.0 | 14493.811 | 19969.41 | 16884.615 | 17250 | 18742.857 | 20395.281 | 14835 | 18908.883 | 15293.222 | 15362.91 | 16640.392 | 17780.611 | 14795.454 | 19743.521 |
| 499.0 | 14486.996 | 19958.31 | 16879.273 | 17250 | 18742.857 | 20395.281 | 14835 | 18908.883 | 15293.222 | 15361.767 | 16640.392 | 17780.611 | 14794.3 | 19740.036 |
| 500.0 | 14480.202 | 19947.222 | 16873.935 | 17250 | 18742.857 | 20395.281 | 14835 | 18908.883 | 15293.222 | 15360.625 | 16640.392 | 17780.611 | 14793.148 | 19736.56 |